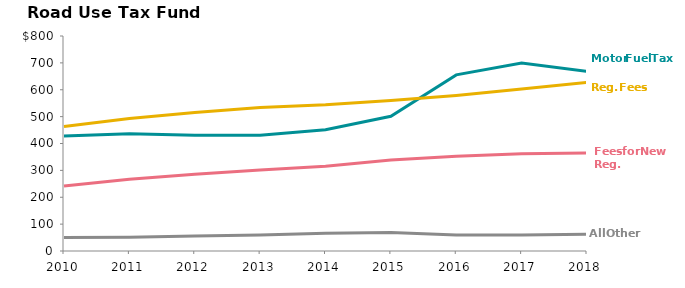
| Category | Motor Fuel Tax | Reg. Fees and Prorate* | Fees for New Reg. | other |
|---|---|---|---|---|
| 2010.0 | 428.27 | 463.078 | 242.29 | 50.485 |
| 2011.0 | 435.835 | 493.299 | 267.015 | 50.84 |
| 2012.0 | 430.409 | 515.648 | 285.844 | 55.902 |
| 2013.0 | 430.703 | 533.947 | 301.492 | 59.132 |
| 2014.0 | 451.324 | 544.063 | 315.579 | 65.979 |
| 2015.0 | 501.228 | 559.653 | 338.292 | 68.956 |
| 2016.0 | 655.3 | 579 | 352.3 | 59.6 |
| 2017.0 | 699.2 | 602.5 | 362.3 | 59.1 |
| 2018.0 | 668.3 | 627.4 | 364.8 | 62.5 |